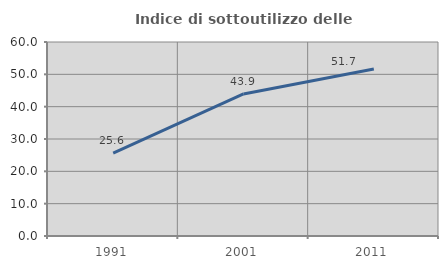
| Category | Indice di sottoutilizzo delle abitazioni  |
|---|---|
| 1991.0 | 25.641 |
| 2001.0 | 43.929 |
| 2011.0 | 51.673 |